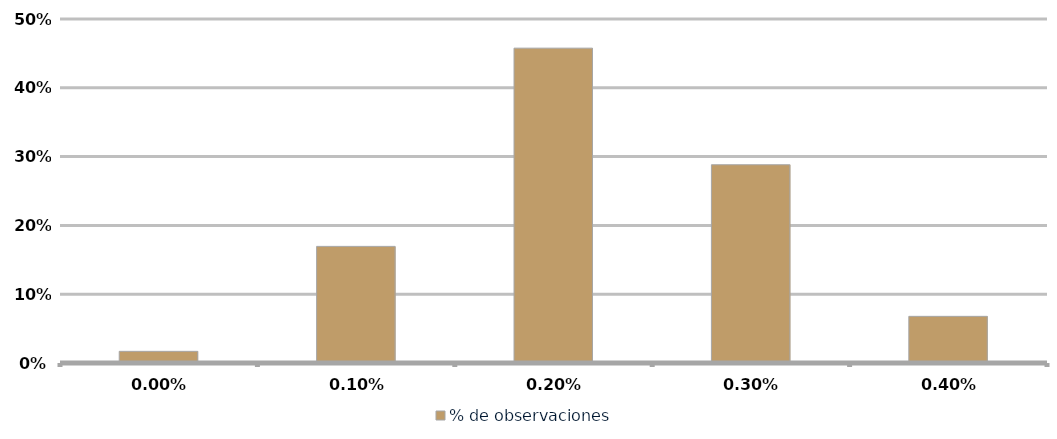
| Category | % de observaciones  |
|---|---|
| 0.0 | 0.017 |
| 0.001 | 0.169 |
| 0.002 | 0.458 |
| 0.003 | 0.288 |
| 0.004 | 0.068 |